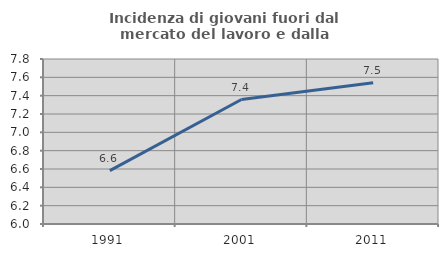
| Category | Incidenza di giovani fuori dal mercato del lavoro e dalla formazione  |
|---|---|
| 1991.0 | 6.582 |
| 2001.0 | 7.358 |
| 2011.0 | 7.54 |